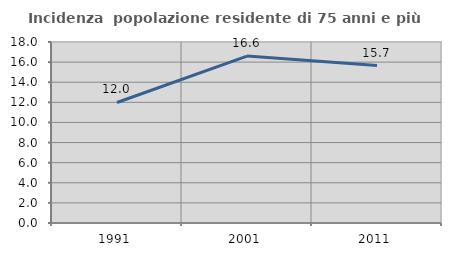
| Category | Incidenza  popolazione residente di 75 anni e più |
|---|---|
| 1991.0 | 11.985 |
| 2001.0 | 16.604 |
| 2011.0 | 15.66 |